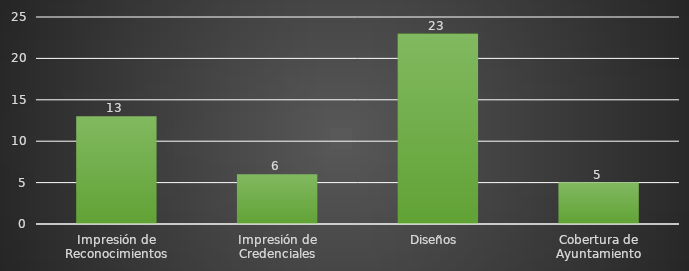
| Category | INDICADOR  |
|---|---|
| Impresión de Reconocimientos | 13 |
| Impresión de Credenciales | 6 |
| Diseños  | 23 |
| Cobertura de Ayuntamiento | 5 |